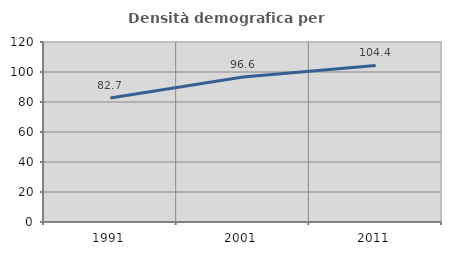
| Category | Densità demografica |
|---|---|
| 1991.0 | 82.709 |
| 2001.0 | 96.617 |
| 2011.0 | 104.365 |